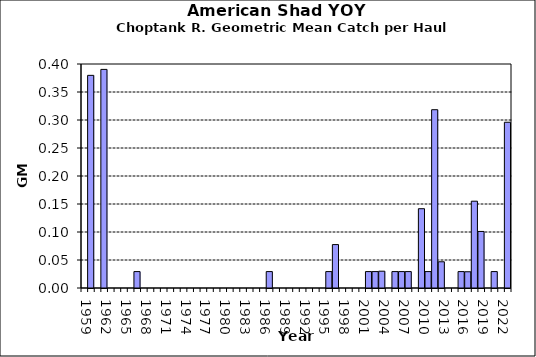
| Category | Series 0 |
|---|---|
| 1959.0 | 0 |
| 1960.0 | 0.38 |
| 1961.0 | 0 |
| 1962.0 | 0.39 |
| 1963.0 | 0 |
| 1964.0 | 0 |
| 1965.0 | 0 |
| 1966.0 | 0 |
| 1967.0 | 0.029 |
| 1968.0 | 0 |
| 1969.0 | 0 |
| 1970.0 | 0 |
| 1971.0 | 0 |
| 1972.0 | 0 |
| 1973.0 | 0 |
| 1974.0 | 0 |
| 1975.0 | 0 |
| 1976.0 | 0 |
| 1977.0 | 0 |
| 1978.0 | 0 |
| 1979.0 | 0 |
| 1980.0 | 0 |
| 1981.0 | 0 |
| 1982.0 | 0 |
| 1983.0 | 0 |
| 1984.0 | 0 |
| 1985.0 | 0 |
| 1986.0 | 0 |
| 1987.0 | 0.029 |
| 1988.0 | 0 |
| 1989.0 | 0 |
| 1990.0 | 0 |
| 1991.0 | 0 |
| 1992.0 | 0 |
| 1993.0 | 0 |
| 1994.0 | 0 |
| 1995.0 | 0 |
| 1996.0 | 0.029 |
| 1997.0 | 0.078 |
| 1998.0 | 0 |
| 1999.0 | 0 |
| 2000.0 | 0 |
| 2001.0 | 0 |
| 2002.0 | 0.029 |
| 2003.0 | 0.029 |
| 2004.0 | 0.03 |
| 2005.0 | 0 |
| 2006.0 | 0.029 |
| 2007.0 | 0.029 |
| 2008.0 | 0.029 |
| 2009.0 | 0 |
| 2010.0 | 0.142 |
| 2011.0 | 0.029 |
| 2012.0 | 0.318 |
| 2013.0 | 0.047 |
| 2014.0 | 0 |
| 2015.0 | 0 |
| 2016.0 | 0.029 |
| 2017.0 | 0.029 |
| 2018.0 | 0.155 |
| 2019.0 | 0.101 |
| 2020.0 | 0 |
| 2021.0 | 0.029 |
| 2022.0 | 0 |
| 2023.0 | 0.296 |